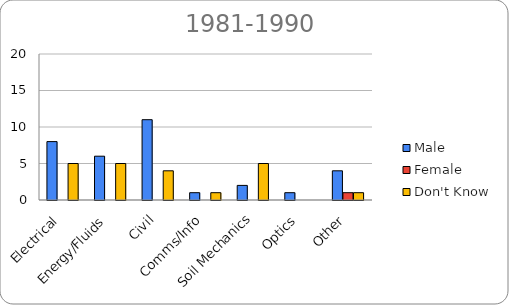
| Category | Male | Female | Don't Know |
|---|---|---|---|
| Electrical | 8 | 0 | 5 |
| Energy/Fluids | 6 | 0 | 5 |
| Civil | 11 | 0 | 4 |
| Comms/Info | 1 | 0 | 1 |
| Soil Mechanics | 2 | 0 | 5 |
| Optics | 1 | 0 | 0 |
| Other | 4 | 1 | 1 |